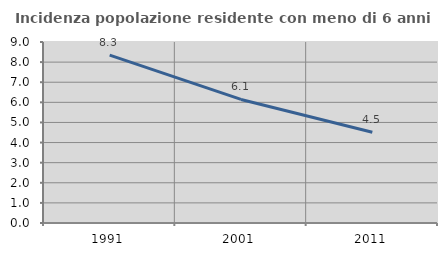
| Category | Incidenza popolazione residente con meno di 6 anni |
|---|---|
| 1991.0 | 8.348 |
| 2001.0 | 6.144 |
| 2011.0 | 4.513 |